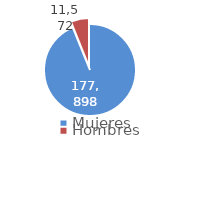
| Category | Series 0 |
|---|---|
| Mujeres | 177898 |
| Hombres | 11572 |